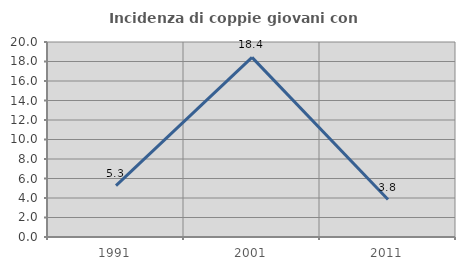
| Category | Incidenza di coppie giovani con figli |
|---|---|
| 1991.0 | 5.263 |
| 2001.0 | 18.421 |
| 2011.0 | 3.846 |